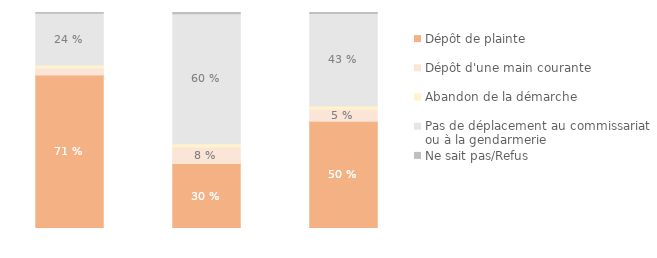
| Category | Dépôt de plainte | Dépôt d'une main courante | Abandon de la démarche | Pas de déplacement au commissariat ou à la gendarmerie | Ne sait pas/Refus |
|---|---|---|---|---|---|
| Ménages victimes d'un cambriolage | 0.711 | 0.032 | 0.015 | 0.239 | 0.003 |
| Ménages victimes d'une tentative | 0.301 | 0.076 | 0.015 | 0.602 | 0.006 |
| Ensemble des ménages victimes | 0.497 | 0.055 | 0.015 | 0.428 | 0.005 |